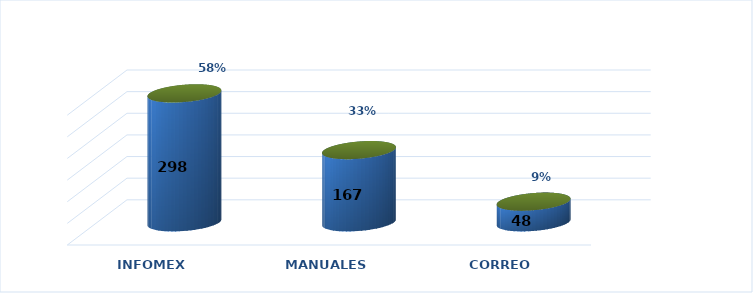
| Category | Series 0 | Series 1 |
|---|---|---|
| INFOMEX | 298 | 0.581 |
| MANUALES | 167 | 0.326 |
| CORREO | 48 | 0.094 |